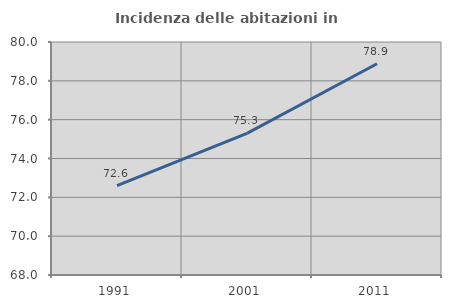
| Category | Incidenza delle abitazioni in proprietà  |
|---|---|
| 1991.0 | 72.601 |
| 2001.0 | 75.293 |
| 2011.0 | 78.879 |